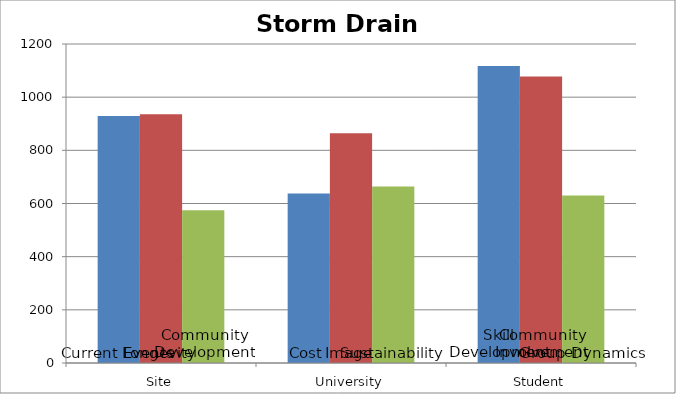
| Category | Alignment1 | Alignment2 | Alignment3 |
|---|---|---|---|
| 0 | 929.375 | 936 | 574.5 |
| 1 | 638 | 864 | 664.375 |
| 2 | 1117.5 | 1077.5 | 630.5 |